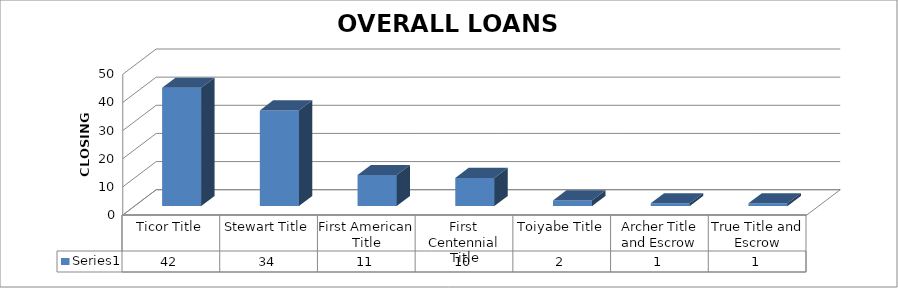
| Category | Series 0 |
|---|---|
| Ticor Title | 42 |
| Stewart Title | 34 |
| First American Title | 11 |
| First Centennial Title | 10 |
| Toiyabe Title | 2 |
| Archer Title and Escrow | 1 |
| True Title and Escrow | 1 |